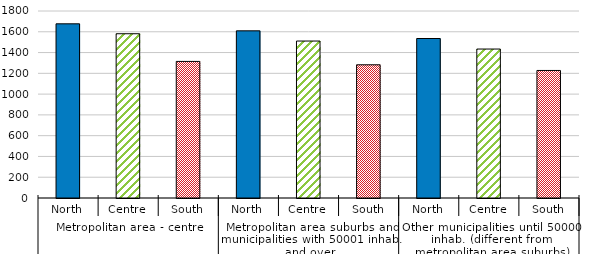
| Category | Series 0 |
|---|---|
| 0 | 1676.54 |
| 1 | 1581.05 |
| 2 | 1314.78 |
| 3 | 1609.06 |
| 4 | 1510.78 |
| 5 | 1282.25 |
| 6 | 1535.19 |
| 7 | 1433.88 |
| 8 | 1227.6 |